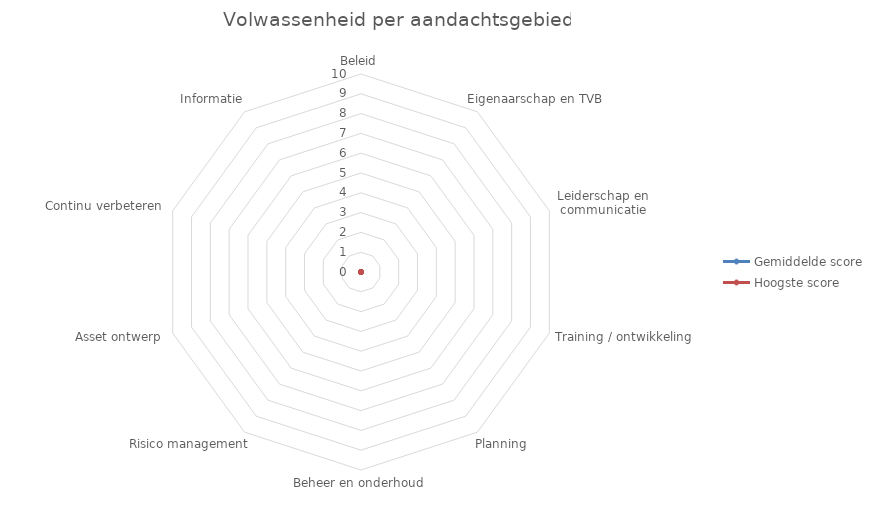
| Category | Gemiddelde score | Hoogste score |
|---|---|---|
| Beleid | 0 | 0 |
| Eigenaarschap en TVB | 0 | 0 |
| Leiderschap en communicatie | 0 | 0 |
| Training / ontwikkeling | 0 | 0 |
| Planning | 0 | 0 |
| Beheer en onderhoud | 0 | 0 |
| Risico management | 0 | 0 |
| Asset ontwerp | 0 | 0 |
| Continu verbeteren | 0 | 0 |
| Informatie | 0 | 0 |